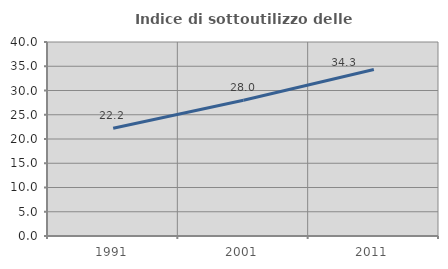
| Category | Indice di sottoutilizzo delle abitazioni  |
|---|---|
| 1991.0 | 22.21 |
| 2001.0 | 27.989 |
| 2011.0 | 34.341 |